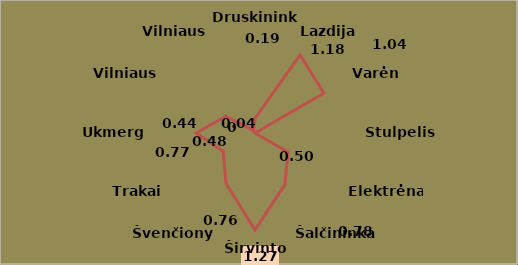
| Category | 1,21 |
|---|---|
| Druskininkai | 0.19 |
| Lazdijai | 1.18 |
| Varėna | 1.04 |
| Stulpelis1 | 0 |
| Elektrėnai | 0.5 |
| Šalčininkai | 0.78 |
| Širvintos | 1.27 |
| Švenčionys | 0.76 |
| Trakai | 0.48 |
| Ukmergė | 0.77 |
| Vilniaus r. | 0.44 |
| Vilniaus m. | 0.04 |